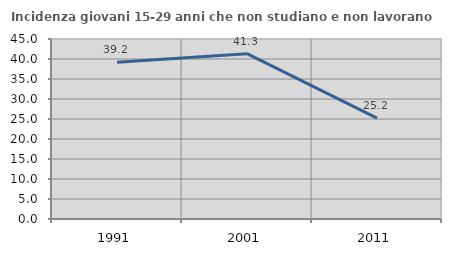
| Category | Incidenza giovani 15-29 anni che non studiano e non lavorano  |
|---|---|
| 1991.0 | 39.181 |
| 2001.0 | 41.329 |
| 2011.0 | 25.203 |